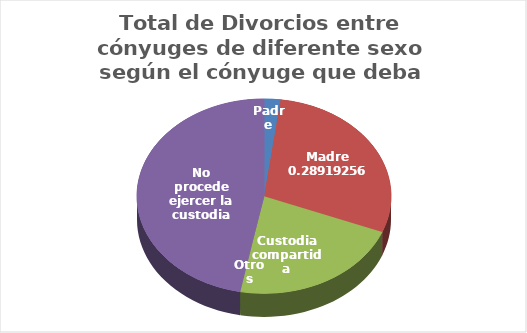
| Category | Series 0 |
|---|---|
| Padre | 1588 |
| Madre | 22009 |
| Custodia compartida | 16723 |
| Otros | 122 |
| No procede ejercer la custodia | 35663 |